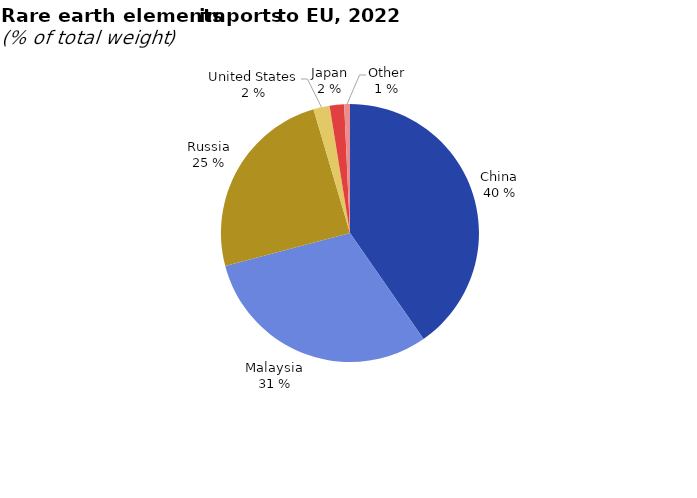
| Category | Share |
|---|---|
| China | 40.343 |
| Malaysia | 30.552 |
| Russia | 24.536 |
| United States | 2.036 |
| Japan | 1.813 |
| Other | 0.72 |